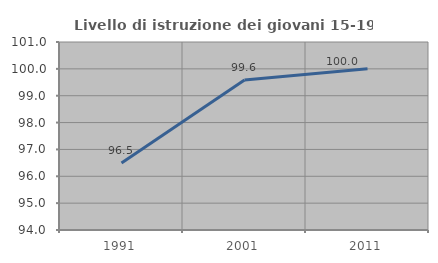
| Category | Livello di istruzione dei giovani 15-19 anni |
|---|---|
| 1991.0 | 96.491 |
| 2001.0 | 99.582 |
| 2011.0 | 100 |